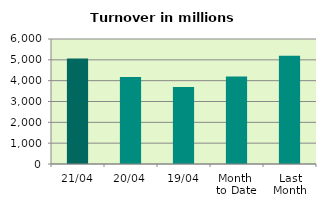
| Category | Series 0 |
|---|---|
| 21/04 | 5061.212 |
| 20/04 | 4178.045 |
| 19/04 | 3701.222 |
| Month 
to Date | 4199.684 |
| Last
Month | 5192.573 |